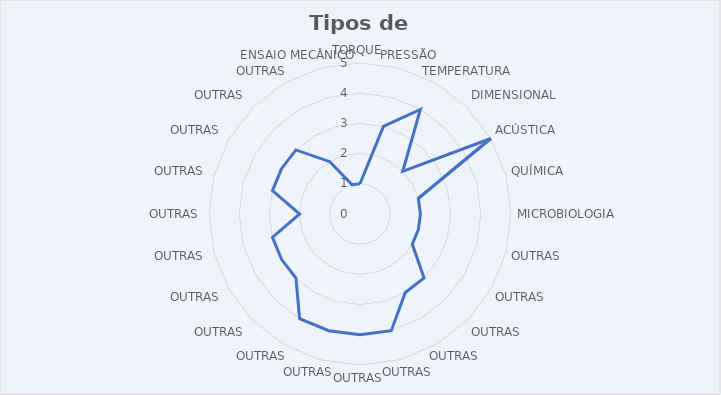
| Category | Series 0 |
|---|---|
| TORQUE | 1 |
| PRESSÃO | 3 |
| TEMPERATURA | 4 |
| DIMENSIONAL | 2 |
| ACÚSTICA | 5 |
| QUÍMICA | 2 |
| MICROBIOLOGIA | 2 |
| OUTRAS | 2 |
| OUTRAS | 2 |
| OUTRAS | 3 |
| OUTRAS | 3 |
| OUTRAS | 4 |
| OUTRAS | 4 |
| OUTRAS | 4 |
| OUTRAS | 4 |
| OUTRAS | 3 |
| OUTRAS | 3 |
| OUTRAS | 3 |
| OUTRAS | 2 |
| OUTRAS | 3 |
| OUTRAS | 3 |
| OUTRAS | 3 |
| OUTRAS | 2 |
| ENSAIO MECÂNICO | 1 |